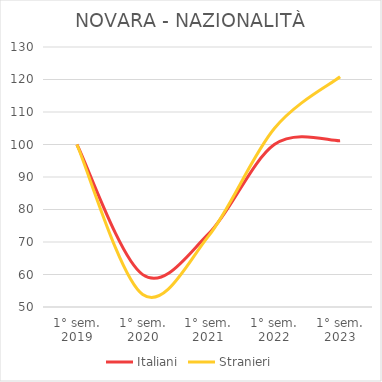
| Category | Italiani | Stranieri |
|---|---|---|
| 1° sem.
2019 | 100 | 100 |
| 1° sem.
2020 | 59.963 | 53.846 |
| 1° sem.
2021 | 72.493 | 71.795 |
| 1° sem.
2022 | 99.973 | 104.915 |
| 1° sem.
2023 | 101.144 | 120.833 |